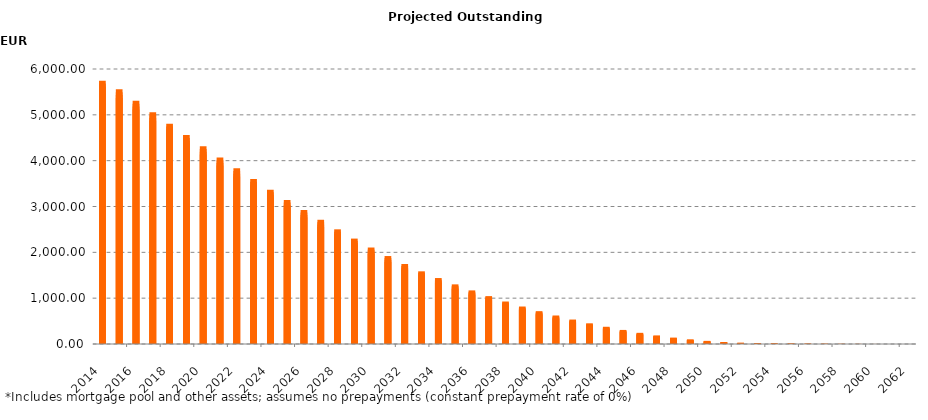
| Category | Series 1 |
|---|---|
| 2014-06-30 | 5744689331.48 |
| 2014-09-30 | 5681709653.24 |
| 2014-12-31 | 5618998358.92 |
| 2015-03-31 | 5556318557.2 |
| 2015-06-30 | 5493663554.16 |
| 2015-09-30 | 5431018552.1 |
| 2015-12-31 | 5368365179.34 |
| 2016-03-31 | 5305751654.84 |
| 2016-06-30 | 5243167817.91 |
| 2016-09-30 | 5180611470.29 |
| 2016-12-31 | 5118071110.11 |
| 2017-03-31 | 5055628666.82 |
| 2017-06-30 | 4993277996.11 |
| 2017-09-30 | 4930962333.87 |
| 2017-12-31 | 4868689564.22 |
| 2018-03-31 | 4806474977.66 |
| 2018-06-30 | 4744331732.02 |
| 2018-09-30 | 4682319423.68 |
| 2018-12-31 | 4620465274.82 |
| 2019-03-31 | 4558746419.04 |
| 2019-06-30 | 4497194839.83 |
| 2019-09-30 | 4435844724.16 |
| 2019-12-31 | 4374677343 |
| 2020-03-31 | 4313667494.45 |
| 2020-06-30 | 4252875050.33 |
| 2020-09-30 | 4192280424.28 |
| 2020-12-31 | 4131890195.55 |
| 2021-03-31 | 4071673355.16 |
| 2021-06-30 | 4011615075.22 |
| 2021-09-30 | 3951782534.07 |
| 2021-12-31 | 3892133666.5 |
| 2022-03-31 | 3832680210.04 |
| 2022-06-30 | 3773495792.62 |
| 2022-09-30 | 3714612123 |
| 2022-12-31 | 3656034360.21 |
| 2023-03-31 | 3597742775.3 |
| 2023-06-30 | 3539767604.25 |
| 2023-09-30 | 3482079035.68 |
| 2023-12-31 | 3424782311.28 |
| 2024-03-31 | 3367804343.48 |
| 2024-06-30 | 3311173373.06 |
| 2024-09-30 | 3254826128.46 |
| 2024-12-31 | 3198849382.97 |
| 2025-03-31 | 3143215966.7 |
| 2025-06-30 | 3087952471.28 |
| 2025-09-30 | 3033060290.11 |
| 2025-12-31 | 2978535179.41 |
| 2026-03-31 | 2924323244.12 |
| 2026-06-30 | 2870418186.2 |
| 2026-09-30 | 2816784280.83 |
| 2026-12-31 | 2763493637.25 |
| 2027-03-31 | 2710538249.02 |
| 2027-06-30 | 2657863246.59 |
| 2027-09-30 | 2605530788.98 |
| 2027-12-31 | 2553562812.39 |
| 2028-03-31 | 2501984769.1 |
| 2028-06-30 | 2450740487.43 |
| 2028-09-30 | 2399902466.06 |
| 2028-12-31 | 2349641218.99 |
| 2029-03-31 | 2299832672.66 |
| 2029-06-30 | 2250458840.99 |
| 2029-09-30 | 2201524290.83 |
| 2029-12-31 | 2153126727.18 |
| 2030-03-31 | 2105143771.15 |
| 2030-06-30 | 2057734122.63 |
| 2030-09-30 | 2010901897.92 |
| 2030-12-31 | 1964755754.33 |
| 2031-03-31 | 1919303158.43 |
| 2031-06-30 | 1874625507.39 |
| 2031-09-30 | 1830745565.54 |
| 2031-12-31 | 1787737576.27 |
| 2032-03-31 | 1745488351.75 |
| 2032-06-30 | 1703925089.37 |
| 2032-09-30 | 1663234169.66 |
| 2032-12-31 | 1623750923.95 |
| 2033-03-31 | 1585542640.52 |
| 2033-06-30 | 1548045221.86 |
| 2033-09-30 | 1511134955.69 |
| 2033-12-31 | 1474869663.66 |
| 2034-03-31 | 1439180059.23 |
| 2034-06-30 | 1404007001.06 |
| 2034-09-30 | 1369294788.97 |
| 2034-12-31 | 1335017068.36 |
| 2035-03-31 | 1301124324.93 |
| 2035-06-30 | 1267635513.75 |
| 2035-09-30 | 1234521091.81 |
| 2035-12-31 | 1201874427.28 |
| 2036-03-31 | 1169593893.09 |
| 2036-06-30 | 1137733724.19 |
| 2036-09-30 | 1106303506.92 |
| 2036-12-31 | 1075324305.54 |
| 2037-03-31 | 1044751325.5 |
| 2037-06-30 | 1014591342.96 |
| 2037-09-30 | 984887124.3 |
| 2037-12-31 | 955717478.14 |
| 2038-03-31 | 927051615.98 |
| 2038-06-30 | 898930673.15 |
| 2038-09-30 | 871377452.23 |
| 2038-12-31 | 844418068.38 |
| 2039-03-31 | 817945914.4 |
| 2039-06-30 | 791928792.65 |
| 2039-09-30 | 766376022.51 |
| 2039-12-31 | 741302221.09 |
| 2040-03-31 | 716598476.02 |
| 2040-06-30 | 692316785.36 |
| 2040-09-30 | 668451069.82 |
| 2040-12-31 | 645070821.78 |
| 2041-03-31 | 622038167.2 |
| 2041-06-30 | 599382412.67 |
| 2041-09-30 | 577109484.25 |
| 2041-12-31 | 555251238.61 |
| 2042-03-31 | 533729172.49 |
| 2042-06-30 | 512568282.92 |
| 2042-09-30 | 491796251.55 |
| 2042-12-31 | 471474805.98 |
| 2043-03-31 | 451510517.79 |
| 2043-06-30 | 431961275.31 |
| 2043-09-30 | 412842633.98 |
| 2043-12-31 | 394233011.73 |
| 2044-03-31 | 375985558.96 |
| 2044-06-30 | 358191048.27 |
| 2044-09-30 | 340751356.51 |
| 2044-12-31 | 323712767.88 |
| 2045-03-31 | 307014096.32 |
| 2045-06-30 | 290643233.07 |
| 2045-09-30 | 274608043.44 |
| 2045-12-31 | 259005080.91 |
| 2046-03-31 | 243783747.29 |
| 2046-06-30 | 228991926.6 |
| 2046-09-30 | 214665347.09 |
| 2046-12-31 | 200868897.86 |
| 2047-03-31 | 187585493.6 |
| 2047-06-30 | 174812549.47 |
| 2047-09-30 | 162581311.65 |
| 2047-12-31 | 150997174.35 |
| 2048-03-31 | 139915129.82 |
| 2048-06-30 | 129376170.9 |
| 2048-09-30 | 119351688.7 |
| 2048-12-31 | 109862125.71 |
| 2049-03-31 | 100733058.99 |
| 2049-06-30 | 91949265.5 |
| 2049-09-30 | 83588273.09 |
| 2049-12-31 | 75696275.07 |
| 2050-03-31 | 68269119.18 |
| 2050-06-30 | 61353800.36 |
| 2050-09-30 | 54969501.24 |
| 2050-12-31 | 49246179.04 |
| 2051-03-31 | 44093169.35 |
| 2051-06-30 | 39486786.46 |
| 2051-09-30 | 35287794.5 |
| 2051-12-31 | 31451601.16 |
| 2052-03-31 | 27894950.37 |
| 2052-06-30 | 24693080.16 |
| 2052-09-30 | 21791576.85 |
| 2052-12-31 | 19278987.41 |
| 2053-03-31 | 17128390.34 |
| 2053-06-30 | 15310599.39 |
| 2053-09-30 | 13800716.23 |
| 2053-12-31 | 12578945.29 |
| 2054-03-31 | 11568554.39 |
| 2054-06-30 | 10743019.14 |
| 2054-09-30 | 9986557.83 |
| 2054-12-31 | 9253304.64 |
| 2055-03-31 | 8555607.11 |
| 2055-06-30 | 7884044.87 |
| 2055-09-30 | 7246329.66 |
| 2055-12-31 | 6636259.64 |
| 2056-03-31 | 6053902.55 |
| 2056-06-30 | 5506351.63 |
| 2056-09-30 | 5000590.16 |
| 2056-12-31 | 4517250.97 |
| 2057-03-31 | 4079809.64 |
| 2057-06-30 | 3670360.15 |
| 2057-09-30 | 3283832.39 |
| 2057-12-31 | 2937299.95 |
| 2058-03-31 | 2619998.11 |
| 2058-06-30 | 2337881.01 |
| 2058-09-30 | 2076262.26 |
| 2058-12-31 | 1833158.48 |
| 2059-03-31 | 1612032.84 |
| 2059-06-30 | 1415957.93 |
| 2059-09-30 | 1227222.41 |
| 2059-12-31 | 1056171.35 |
| 2060-03-31 | 900712.1 |
| 2060-06-30 | 758261.5 |
| 2060-09-30 | 631522.86 |
| 2060-12-31 | 519580.89 |
| 2061-03-31 | 417755.63 |
| 2061-06-30 | 334038.39 |
| 2061-09-30 | 267138.92 |
| 2061-12-31 | 217459.65 |
| 2062-03-31 | 173472.76 |
| 2062-06-30 | 133144.28 |
| 2062-09-30 | 100701.34 |
| 2062-12-31 | 71045.89 |
| 2063-03-31 | 45445.36 |
| 2063-06-30 | 28203.55 |
| 2063-09-30 | 13919.23 |
| 2063-12-31 | 4273.58 |